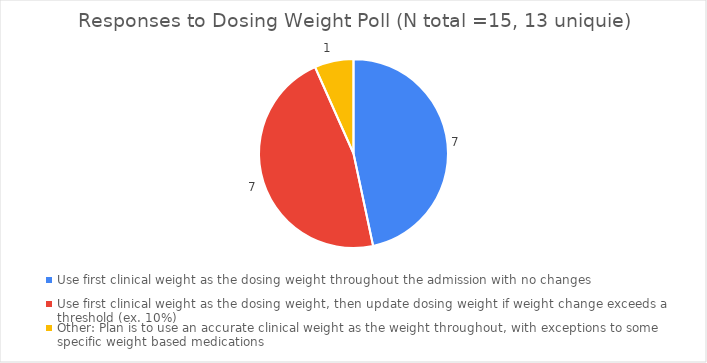
| Category | Series 0 |
|---|---|
| Use first clinical weight as the dosing weight throughout the admission with no changes | 7 |
| Use first clinical weight as the dosing weight, then update dosing weight if weight change exceeds a threshold (ex. 10%) | 7 |
| Other: Plan is to use an accurate clinical weight as the weight throughout, with exceptions to some specific weight based medications | 1 |